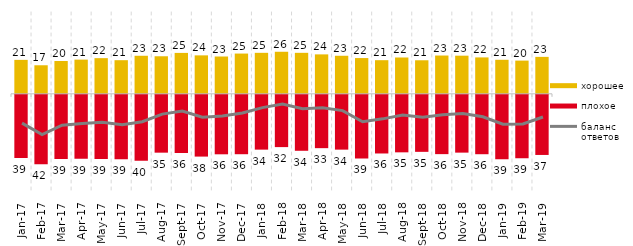
| Category | хорошее | плохое |
|---|---|---|
| 2017-01-01 | 20.75 | -38.65 |
| 2017-02-01 | 17.45 | -42.4 |
| 2017-03-01 | 20.05 | -39.25 |
| 2017-04-01 | 20.9 | -39 |
| 2017-05-01 | 21.8 | -39.15 |
| 2017-06-01 | 20.55 | -39.4 |
| 2017-07-01 | 23.25 | -40.3 |
| 2017-08-01 | 22.95 | -35.35 |
| 2017-09-01 | 25 | -35.55 |
| 2017-10-01 | 23.5 | -37.75 |
| 2017-11-01 | 22.8 | -36.35 |
| 2017-12-01 | 24.6 | -36.3 |
| 2018-01-01 | 25.05 | -33.5 |
| 2018-02-01 | 25.7 | -31.95 |
| 2018-03-01 | 25.05 | -34.2 |
| 2018-04-01 | 24.1 | -32.6 |
| 2018-05-01 | 23.25 | -33.5 |
| 2018-06-01 | 21.85 | -38.9 |
| 2018-07-01 | 20.55 | -35.85 |
| 2018-08-01 | 22.2 | -35.15 |
| 2018-09-01 | 20.5 | -34.85 |
| 2018-10-01 | 23.4 | -36.25 |
| 2018-11-01 | 23.303 | -35.329 |
| 2018-12-01 | 22.25 | -36.3 |
| 2019-01-01 | 20.8 | -39.35 |
| 2019-02-01 | 20.3 | -38.75 |
| 2019-03-01 | 22.576 | -36.748 |